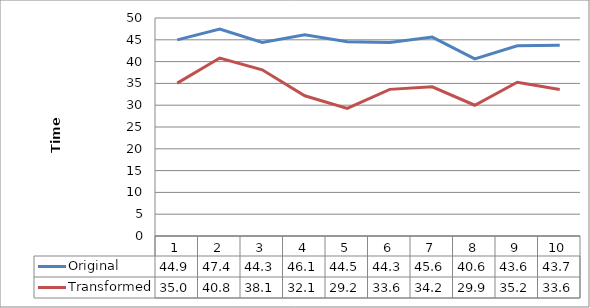
| Category | Original | Transformed |
|---|---|---|
| 0 | 44.98 | 35.06 |
| 1 | 47.45 | 40.82 |
| 2 | 44.38 | 38.11 |
| 3 | 46.13 | 32.16 |
| 4 | 44.56 | 29.26 |
| 5 | 44.38 | 33.63 |
| 6 | 45.62 | 34.23 |
| 7 | 40.62 | 29.99 |
| 8 | 43.63 | 35.27 |
| 9 | 43.75 | 33.62 |